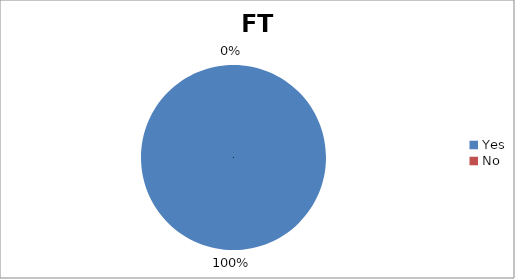
| Category | FT Resident |
|---|---|
| Yes | 7 |
| No | 0 |